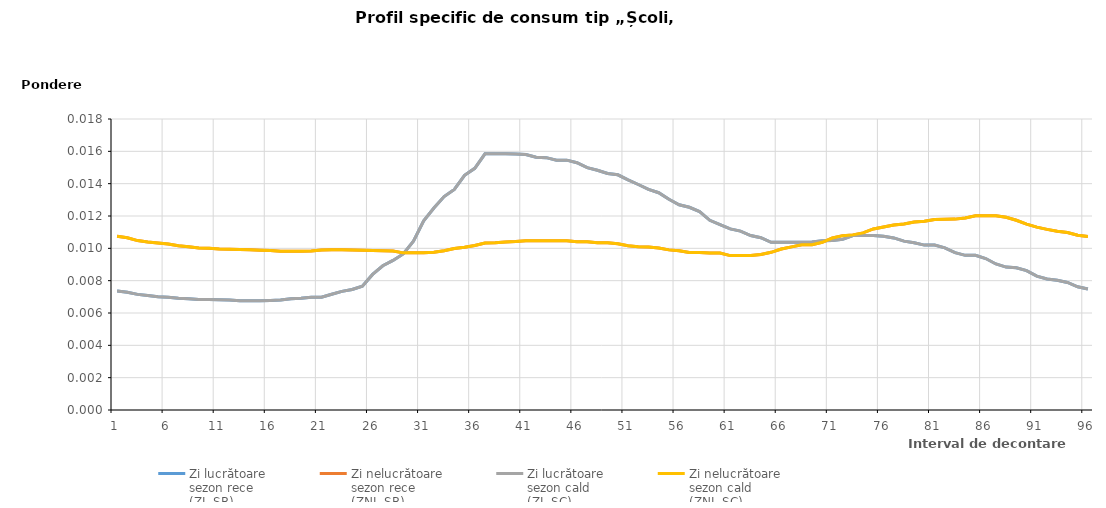
| Category | Zi lucrătoare 
sezon rece
(ZL-SR) | Zi nelucrătoare 
sezon rece
(ZNL-SR) | Zi lucrătoare 
sezon cald
(ZL-SC) | Zi nelucrătoare 
sezon cald
(ZNL-SC) |
|---|---|---|---|---|
| 1.0 | 0.007 | 0.011 | 0.007 | 0.011 |
| 2.0 | 0.007 | 0.011 | 0.007 | 0.011 |
| 3.0 | 0.007 | 0.01 | 0.007 | 0.01 |
| 4.0 | 0.007 | 0.01 | 0.007 | 0.01 |
| 5.0 | 0.007 | 0.01 | 0.007 | 0.01 |
| 6.0 | 0.007 | 0.01 | 0.007 | 0.01 |
| 7.0 | 0.007 | 0.01 | 0.007 | 0.01 |
| 8.0 | 0.007 | 0.01 | 0.007 | 0.01 |
| 9.0 | 0.007 | 0.01 | 0.007 | 0.01 |
| 10.0 | 0.007 | 0.01 | 0.007 | 0.01 |
| 11.0 | 0.007 | 0.01 | 0.007 | 0.01 |
| 12.0 | 0.007 | 0.01 | 0.007 | 0.01 |
| 13.0 | 0.007 | 0.01 | 0.007 | 0.01 |
| 14.0 | 0.007 | 0.01 | 0.007 | 0.01 |
| 15.0 | 0.007 | 0.01 | 0.007 | 0.01 |
| 16.0 | 0.007 | 0.01 | 0.007 | 0.01 |
| 17.0 | 0.007 | 0.01 | 0.007 | 0.01 |
| 18.0 | 0.007 | 0.01 | 0.007 | 0.01 |
| 19.0 | 0.007 | 0.01 | 0.007 | 0.01 |
| 20.0 | 0.007 | 0.01 | 0.007 | 0.01 |
| 21.0 | 0.007 | 0.01 | 0.007 | 0.01 |
| 22.0 | 0.007 | 0.01 | 0.007 | 0.01 |
| 23.0 | 0.007 | 0.01 | 0.007 | 0.01 |
| 24.0 | 0.007 | 0.01 | 0.007 | 0.01 |
| 25.0 | 0.008 | 0.01 | 0.008 | 0.01 |
| 26.0 | 0.008 | 0.01 | 0.008 | 0.01 |
| 27.0 | 0.009 | 0.01 | 0.009 | 0.01 |
| 28.0 | 0.009 | 0.01 | 0.009 | 0.01 |
| 29.0 | 0.01 | 0.01 | 0.01 | 0.01 |
| 30.0 | 0.01 | 0.01 | 0.01 | 0.01 |
| 31.0 | 0.012 | 0.01 | 0.012 | 0.01 |
| 32.0 | 0.012 | 0.01 | 0.012 | 0.01 |
| 33.0 | 0.013 | 0.01 | 0.013 | 0.01 |
| 34.0 | 0.014 | 0.01 | 0.014 | 0.01 |
| 35.0 | 0.015 | 0.01 | 0.015 | 0.01 |
| 36.0 | 0.015 | 0.01 | 0.015 | 0.01 |
| 37.0 | 0.016 | 0.01 | 0.016 | 0.01 |
| 38.0 | 0.016 | 0.01 | 0.016 | 0.01 |
| 39.0 | 0.016 | 0.01 | 0.016 | 0.01 |
| 40.0 | 0.016 | 0.01 | 0.016 | 0.01 |
| 41.0 | 0.016 | 0.01 | 0.016 | 0.01 |
| 42.0 | 0.016 | 0.01 | 0.016 | 0.01 |
| 43.0 | 0.016 | 0.01 | 0.016 | 0.01 |
| 44.0 | 0.015 | 0.01 | 0.015 | 0.01 |
| 45.0 | 0.015 | 0.01 | 0.015 | 0.01 |
| 46.0 | 0.015 | 0.01 | 0.015 | 0.01 |
| 47.0 | 0.015 | 0.01 | 0.015 | 0.01 |
| 48.0 | 0.015 | 0.01 | 0.015 | 0.01 |
| 49.0 | 0.015 | 0.01 | 0.015 | 0.01 |
| 50.0 | 0.015 | 0.01 | 0.015 | 0.01 |
| 51.0 | 0.014 | 0.01 | 0.014 | 0.01 |
| 52.0 | 0.014 | 0.01 | 0.014 | 0.01 |
| 53.0 | 0.014 | 0.01 | 0.014 | 0.01 |
| 54.0 | 0.013 | 0.01 | 0.013 | 0.01 |
| 55.0 | 0.013 | 0.01 | 0.013 | 0.01 |
| 56.0 | 0.013 | 0.01 | 0.013 | 0.01 |
| 57.0 | 0.013 | 0.01 | 0.013 | 0.01 |
| 58.0 | 0.012 | 0.01 | 0.012 | 0.01 |
| 59.0 | 0.012 | 0.01 | 0.012 | 0.01 |
| 60.0 | 0.011 | 0.01 | 0.011 | 0.01 |
| 61.0 | 0.011 | 0.01 | 0.011 | 0.01 |
| 62.0 | 0.011 | 0.01 | 0.011 | 0.01 |
| 63.0 | 0.011 | 0.01 | 0.011 | 0.01 |
| 64.0 | 0.011 | 0.01 | 0.011 | 0.01 |
| 65.0 | 0.01 | 0.01 | 0.01 | 0.01 |
| 66.0 | 0.01 | 0.01 | 0.01 | 0.01 |
| 67.0 | 0.01 | 0.01 | 0.01 | 0.01 |
| 68.0 | 0.01 | 0.01 | 0.01 | 0.01 |
| 69.0 | 0.01 | 0.01 | 0.01 | 0.01 |
| 70.0 | 0.01 | 0.01 | 0.01 | 0.01 |
| 71.0 | 0.01 | 0.011 | 0.01 | 0.011 |
| 72.0 | 0.011 | 0.011 | 0.011 | 0.011 |
| 73.0 | 0.011 | 0.011 | 0.011 | 0.011 |
| 74.0 | 0.011 | 0.011 | 0.011 | 0.011 |
| 75.0 | 0.011 | 0.011 | 0.011 | 0.011 |
| 76.0 | 0.011 | 0.011 | 0.011 | 0.011 |
| 77.0 | 0.011 | 0.011 | 0.011 | 0.011 |
| 78.0 | 0.01 | 0.012 | 0.01 | 0.012 |
| 79.0 | 0.01 | 0.012 | 0.01 | 0.012 |
| 80.0 | 0.01 | 0.012 | 0.01 | 0.012 |
| 81.0 | 0.01 | 0.012 | 0.01 | 0.012 |
| 82.0 | 0.01 | 0.012 | 0.01 | 0.012 |
| 83.0 | 0.01 | 0.012 | 0.01 | 0.012 |
| 84.0 | 0.01 | 0.012 | 0.01 | 0.012 |
| 85.0 | 0.01 | 0.012 | 0.01 | 0.012 |
| 86.0 | 0.009 | 0.012 | 0.009 | 0.012 |
| 87.0 | 0.009 | 0.012 | 0.009 | 0.012 |
| 88.0 | 0.009 | 0.012 | 0.009 | 0.012 |
| 89.0 | 0.009 | 0.012 | 0.009 | 0.012 |
| 90.0 | 0.009 | 0.012 | 0.009 | 0.012 |
| 91.0 | 0.008 | 0.011 | 0.008 | 0.011 |
| 92.0 | 0.008 | 0.011 | 0.008 | 0.011 |
| 93.0 | 0.008 | 0.011 | 0.008 | 0.011 |
| 94.0 | 0.008 | 0.011 | 0.008 | 0.011 |
| 95.0 | 0.008 | 0.011 | 0.008 | 0.011 |
| 96.0 | 0.007 | 0.011 | 0.007 | 0.011 |